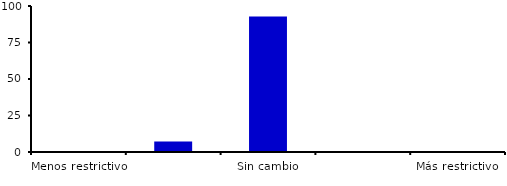
| Category | Series 0 |
|---|---|
| Menos restrictivo | 0 |
| Moderadamente menos restrictivo | 7.143 |
| Sin cambio | 92.857 |
| Moderadamente más restrictivo | 0 |
| Más restrictivo | 0 |